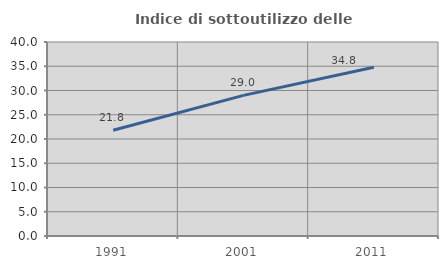
| Category | Indice di sottoutilizzo delle abitazioni  |
|---|---|
| 1991.0 | 21.796 |
| 2001.0 | 28.988 |
| 2011.0 | 34.806 |